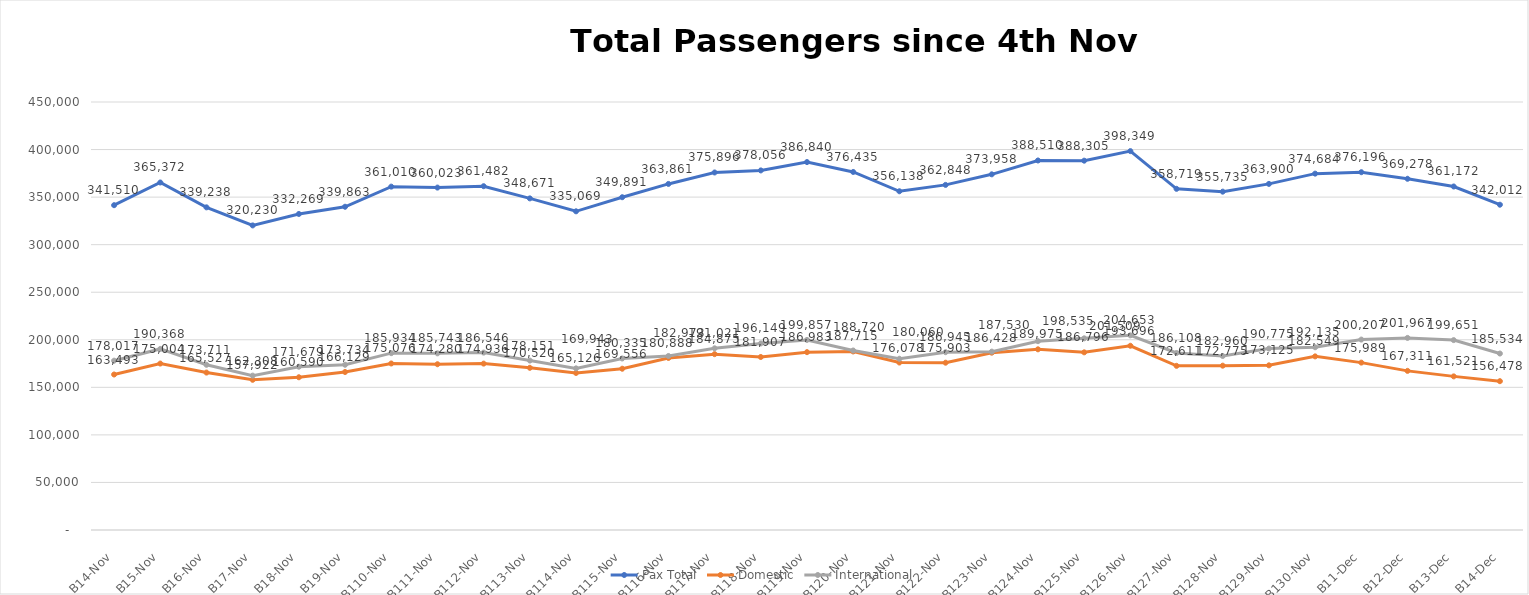
| Category | Pax Total | Domestic | International |
|---|---|---|---|
| 2023-11-04 | 341510 | 163493 | 178017 |
| 2023-11-05 | 365372 | 175004 | 190368 |
| 2023-11-06 | 339238 | 165527 | 173711 |
| 2023-11-07 | 320230 | 157922 | 162308 |
| 2023-11-08 | 332269 | 160590 | 171679 |
| 2023-11-09 | 339863 | 166129 | 173734 |
| 2023-11-10 | 361010 | 175076 | 185934 |
| 2023-11-11 | 360023 | 174280 | 185743 |
| 2023-11-12 | 361482 | 174936 | 186546 |
| 2023-11-13 | 348671 | 170520 | 178151 |
| 2023-11-14 | 335069 | 165126 | 169943 |
| 2023-11-15 | 349891 | 169556 | 180335 |
| 2023-11-16 | 363861 | 180888 | 182973 |
| 2023-11-17 | 375896 | 184875 | 191021 |
| 2023-11-18 | 378056 | 181907 | 196149 |
| 2023-11-19 | 386840 | 186983 | 199857 |
| 2023-11-20 | 376435 | 187715 | 188720 |
| 2023-11-21 | 356138 | 176078 | 180060 |
| 2023-11-22 | 362848 | 175903 | 186945 |
| 2023-11-23 | 373958 | 186428 | 187530 |
| 2023-11-24 | 388510 | 189975 | 198535 |
| 2023-11-25 | 388305 | 186796 | 201509 |
| 2023-11-26 | 398349 | 193696 | 204653 |
| 2023-11-27 | 358719 | 172611 | 186108 |
| 2023-11-28 | 355735 | 172775 | 182960 |
| 2023-11-29 | 363900 | 173125 | 190775 |
| 2023-11-30 | 374684 | 182549 | 192135 |
| 2023-12-01 | 376196 | 175989 | 200207 |
| 2023-12-02 | 369278 | 167311 | 201967 |
| 2023-12-03 | 361172 | 161521 | 199651 |
| 2023-12-04 | 342012 | 156478 | 185534 |